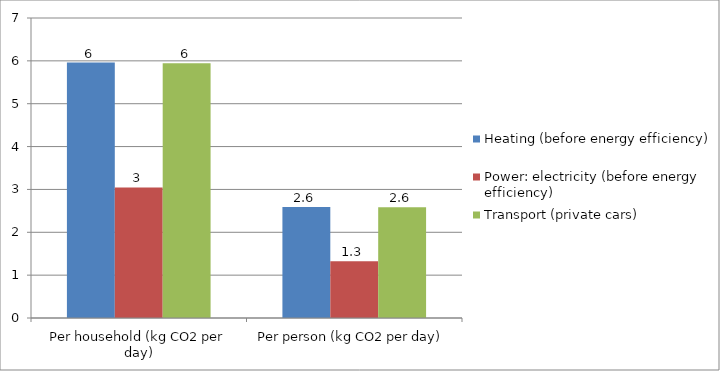
| Category | Heating (before energy efficiency) | Power: electricity (before energy efficiency) | Transport (private cars) |
|---|---|---|---|
| Per household (kg CO2 per day) | 5.96 | 3.047 | 5.943 |
| Per person (kg CO2 per day) | 2.591 | 1.325 | 2.584 |